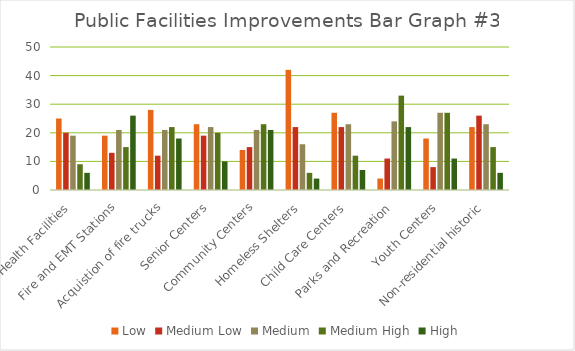
| Category | Low | Medium Low | Medium | Medium High | High |
|---|---|---|---|---|---|
| Health Facilities | 25 | 20 | 19 | 9 | 6 |
| Fire and EMT Stations | 19 | 13 | 21 | 15 | 26 |
| Acquistion of fire trucks | 28 | 12 | 21 | 22 | 18 |
| Senior Centers | 23 | 19 | 22 | 20 | 10 |
| Community Centers | 14 | 15 | 21 | 23 | 21 |
| Homeless Shelters | 42 | 22 | 16 | 6 | 4 |
| Child Care Centers | 27 | 22 | 23 | 12 | 7 |
| Parks and Recreation | 4 | 11 | 24 | 33 | 22 |
| Youth Centers | 18 | 8 | 27 | 27 | 11 |
| Non-residential historic | 22 | 26 | 23 | 15 | 6 |